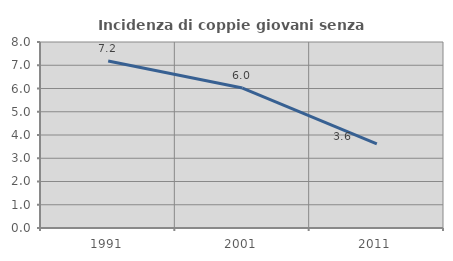
| Category | Incidenza di coppie giovani senza figli |
|---|---|
| 1991.0 | 7.181 |
| 2001.0 | 6.019 |
| 2011.0 | 3.616 |